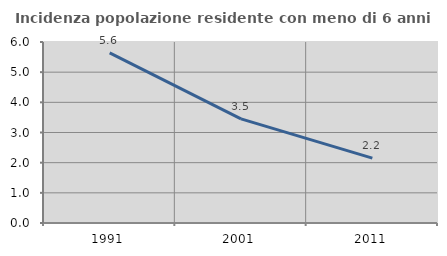
| Category | Incidenza popolazione residente con meno di 6 anni |
|---|---|
| 1991.0 | 5.637 |
| 2001.0 | 3.452 |
| 2011.0 | 2.151 |